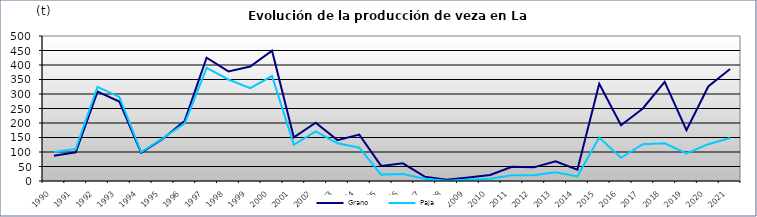
| Category | Grano | Paja |
|---|---|---|
| 1990.0 | 87 | 100 |
| 1991.0 | 99 | 110 |
| 1992.0 | 308 | 325 |
| 1993.0 | 274 | 290 |
| 1994.0 | 97 | 100 |
| 1995.0 | 146 | 148 |
| 1996.0 | 208 | 199 |
| 1997.0 | 425 | 390 |
| 1998.0 | 378 | 350 |
| 1999.0 | 394.8 | 320 |
| 2000.0 | 449.1 | 362 |
| 2001.0 | 150.3 | 124.9 |
| 2002.0 | 201 | 171 |
| 2003.0 | 141 | 130 |
| 2004.0 | 160 | 115 |
| 2005.0 | 52 | 22 |
| 2006.0 | 61 | 24 |
| 2007.0 | 15 | 8 |
| 2008.0 | 4 | 1 |
| 2009.0 | 12 | 4 |
| 2010.0 | 21 | 8 |
| 2011.0 | 49 | 20 |
| 2012.0 | 47 | 20 |
| 2013.0 | 68 | 30 |
| 2014.0 | 39 | 16 |
| 2015.0 | 335 | 150 |
| 2016.0 | 192 | 80 |
| 2017.0 | 250 | 127 |
| 2018.0 | 342 | 130 |
| 2019.0 | 175 | 95 |
| 2020.0 | 326 | 127 |
| 2021.0 | 386 | 148 |